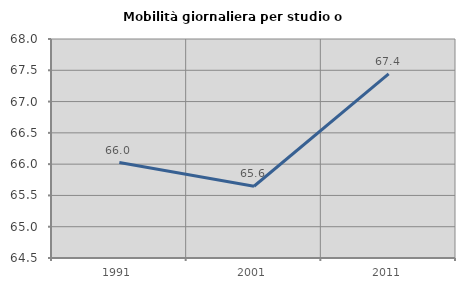
| Category | Mobilità giornaliera per studio o lavoro |
|---|---|
| 1991.0 | 66.025 |
| 2001.0 | 65.647 |
| 2011.0 | 67.443 |